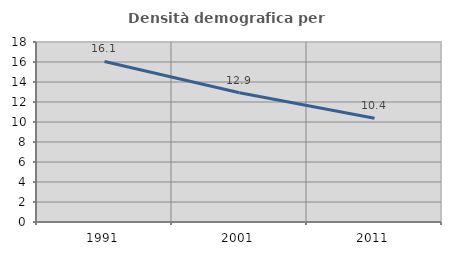
| Category | Densità demografica |
|---|---|
| 1991.0 | 16.058 |
| 2001.0 | 12.925 |
| 2011.0 | 10.379 |